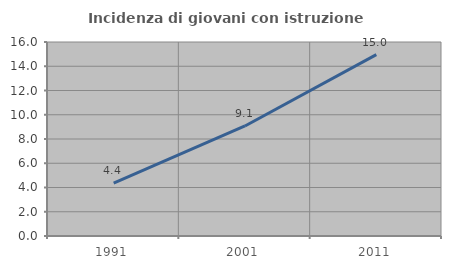
| Category | Incidenza di giovani con istruzione universitaria |
|---|---|
| 1991.0 | 4.361 |
| 2001.0 | 9.075 |
| 2011.0 | 14.953 |